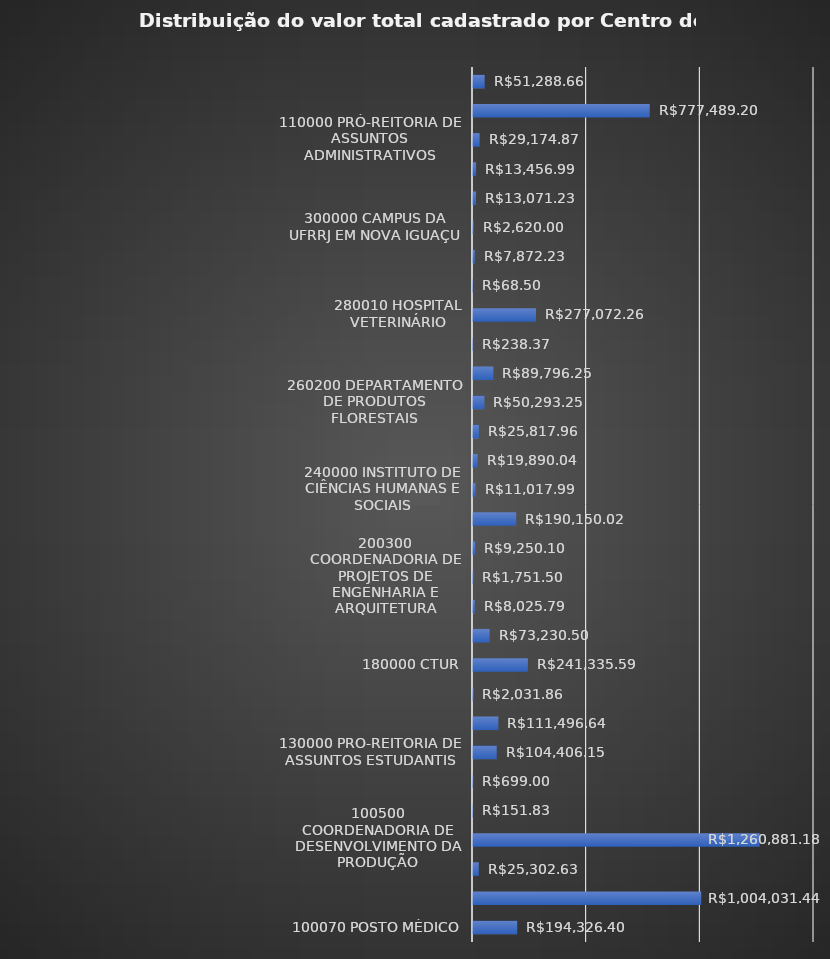
| Category | Series 0 |
|---|---|
| 100070 POSTO MÉDICO | 194326.4 |
| 100300 PREFEITURA UNIVERSITÁRIA | 1004031.44 |
| 100500 CASTE | 25302.63 |
| 100500 COORDENADORIA DE DESENVOLVIMENTO DA PRODUÇÃO | 1260881.18 |
| 110200 SEÇÃO DE ARQUIVO E PROTOCOLO GERAL | 151.83 |
| 110310 DIVISÃO DE CONCURSOS | 699 |
| 130000 PRÓ-REITORIA DE ASSUNTOS ESTUDANTIS | 104406.15 |
| 150100 Proext/Departamento de Esporte e Lazer | 111496.64 |
| 160100 PROAP - PRÓ-REITORIA DE PESQUISA E PÓS GRADUAÇÃO | 2031.86 |
| 180000 CTUR | 241335.59 |
| 190000 CAMPUS DR. LEONEL MIRANDA | 73230.5 |
| 200200 COORDENADORIA DE TECNOLOGIA DA INFORMAÇÃO E COMUNICAÇÃO | 8025.79 |
| 200300 COORDENADORIA DE PROJETOS DE ENGENHARIA E ARQUITETURA | 1751.5 |
| 210400 DEPARTAMENTO DE PETROLOGIA E GEOTECTÔNICA | 9250.1 |
| 220000 INSTITUTO DE BIOLOGIA | 190150.02 |
| 240000 INSTITUTO DE CIÊNCIAS HUMANAS E SOCIAIS | 11017.99 |
| 250000 INSTITUTO DE EDUCAÇÃO | 19890.04 |
| 260000 INSTITUTO DE FLORESTAS | 25817.96 |
| 260200 DEPARTAMENTO DE PRODUTOS FLORESTAIS | 50293.25 |
| 270200 DEPARTAMENTO DE ENGENHARIA | 89796.25 |
| 280000 INSTITUTO DE VETERINÁRIA | 238.37 |
| 280010 HOSPITAL VETERINÁRIO | 277072.26 |
| 280300 DEPTO DE MICROBIOLOGIA E IMUNOLOGIA VETERINÁRIA | 68.5 |
| 290000 INSTITUTO DE ZOOTECNIA | 7872.23 |
| 300000 CAMPUS DA UFRRJ EM NOVA IGUAÇU | 2620 |
| 400000 CAMPUS DA UFRRJ EM TRÊS RIOS | 13071.23 |
| 710000 INSTITUTO DE QUÍMICA | 13456.99 |
| 110000 PRÓ-REITORIA DE ASSUNTOS ADMINISTRATIVOS | 29174.87 |
| 310100 RESTAURANTE UNIVERSITÁRIO DO CAMPUS NOVA IGUAÇU | 777489.2 |
| 300100  CAMPUS NOVA IGUAÇU | 51288.66 |